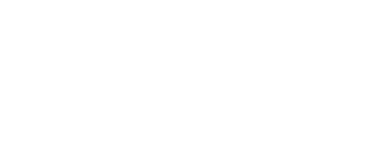
| Category | Series 0 |
|---|---|
| צדקה | 0 |
| מזון | 0 |
| בית | 0 |
| ביגוד | 0 |
| חינוך | 0 |
| רכב | 0 |
| תקשורת  | 0 |
| חינוך | 0 |
| רכב | 0 |
| תקשורת  | 0 |
| חינוך | 0 |
| רכב | 0 |
| תקשורת  | 0 |
| כללי | 0 |